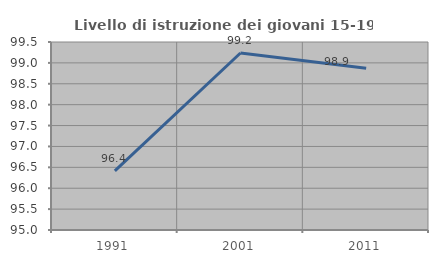
| Category | Livello di istruzione dei giovani 15-19 anni |
|---|---|
| 1991.0 | 96.414 |
| 2001.0 | 99.237 |
| 2011.0 | 98.87 |